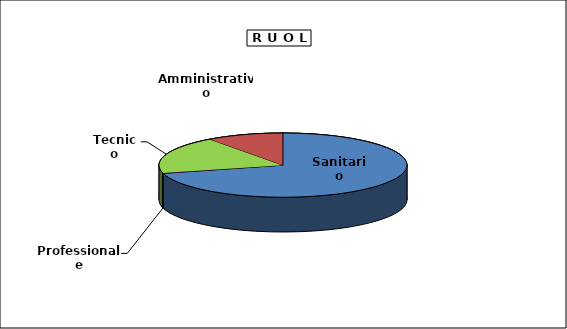
| Category | Personale |
|---|---|
| Professionale | 187 |
| Tecnico | 16742 |
| Amministrativo | 8863 |
| Sanitario | 62661 |